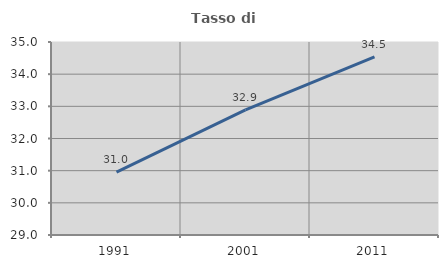
| Category | Tasso di occupazione   |
|---|---|
| 1991.0 | 30.954 |
| 2001.0 | 32.89 |
| 2011.0 | 34.541 |